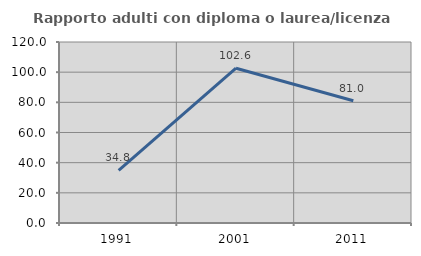
| Category | Rapporto adulti con diploma o laurea/licenza media  |
|---|---|
| 1991.0 | 34.836 |
| 2001.0 | 102.642 |
| 2011.0 | 81.026 |